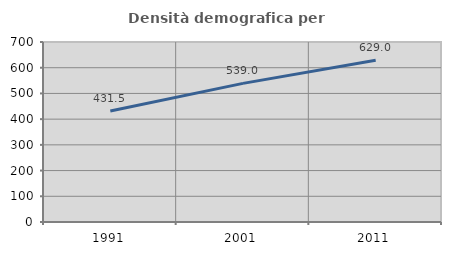
| Category | Densità demografica |
|---|---|
| 1991.0 | 431.487 |
| 2001.0 | 539.013 |
| 2011.0 | 629.027 |